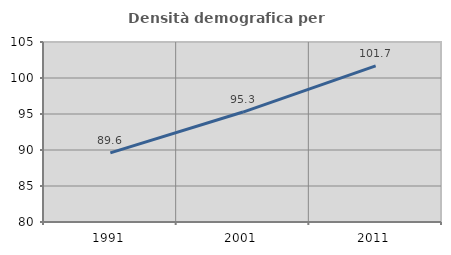
| Category | Densità demografica |
|---|---|
| 1991.0 | 89.598 |
| 2001.0 | 95.27 |
| 2011.0 | 101.695 |